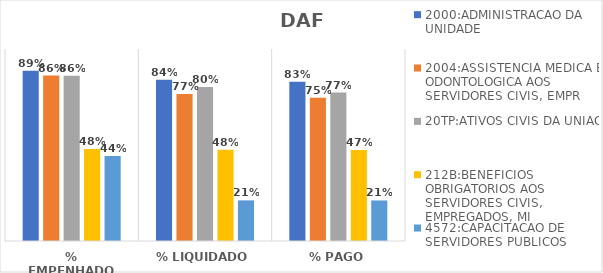
| Category | 2000:ADMINISTRACAO DA UNIDADE | 2004:ASSISTENCIA MEDICA E ODONTOLOGICA AOS SERVIDORES CIVIS, EMPR | 20TP:ATIVOS CIVIS DA UNIAO | 212B:BENEFICIOS OBRIGATORIOS AOS SERVIDORES CIVIS, EMPREGADOS, MI | 4572:CAPACITACAO DE SERVIDORES PUBLICOS FEDERAIS EM PROCESSO DE Q |
|---|---|---|---|---|---|
| % EMPENHADO | 0.887 | 0.862 | 0.861 | 0.479 | 0.443 |
| % LIQUIDADO | 0.839 | 0.765 | 0.802 | 0.475 | 0.212 |
| % PAGO | 0.83 | 0.746 | 0.773 | 0.474 | 0.211 |